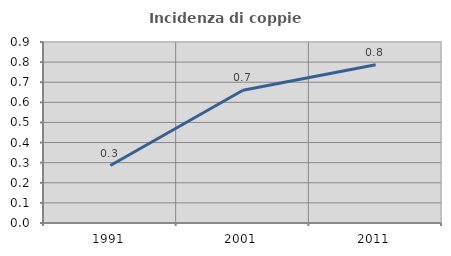
| Category | Incidenza di coppie miste |
|---|---|
| 1991.0 | 0.286 |
| 2001.0 | 0.66 |
| 2011.0 | 0.787 |